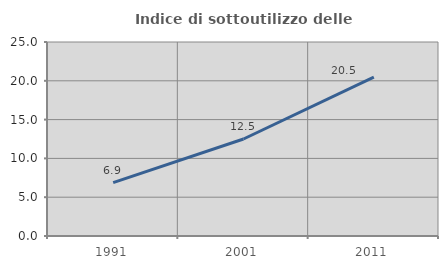
| Category | Indice di sottoutilizzo delle abitazioni  |
|---|---|
| 1991.0 | 6.878 |
| 2001.0 | 12.5 |
| 2011.0 | 20.468 |